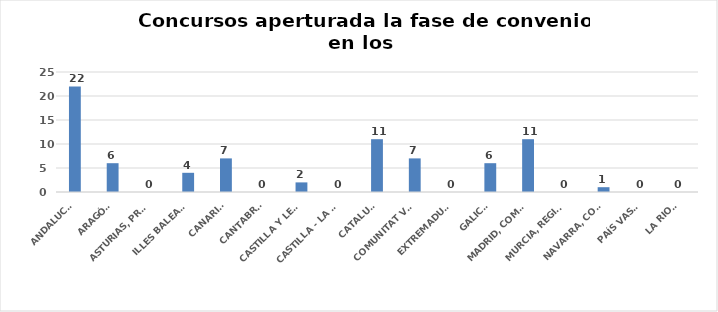
| Category | Series 0 |
|---|---|
| ANDALUCÍA | 22 |
| ARAGÓN | 6 |
| ASTURIAS, PRINCIPADO | 0 |
| ILLES BALEARS | 4 |
| CANARIAS | 7 |
| CANTABRIA | 0 |
| CASTILLA Y LEÓN | 2 |
| CASTILLA - LA MANCHA | 0 |
| CATALUÑA | 11 |
| COMUNITAT VALENCIANA | 7 |
| EXTREMADURA | 0 |
| GALICIA | 6 |
| MADRID, COMUNIDAD | 11 |
| MURCIA, REGIÓN | 0 |
| NAVARRA, COM. FORAL | 1 |
| PAÍS VASCO | 0 |
| LA RIOJA | 0 |